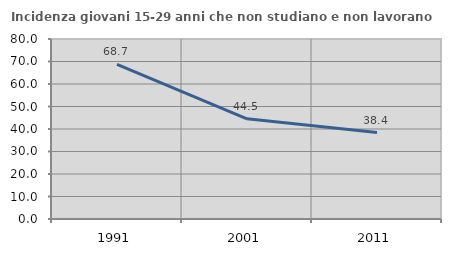
| Category | Incidenza giovani 15-29 anni che non studiano e non lavorano  |
|---|---|
| 1991.0 | 68.692 |
| 2001.0 | 44.533 |
| 2011.0 | 38.395 |